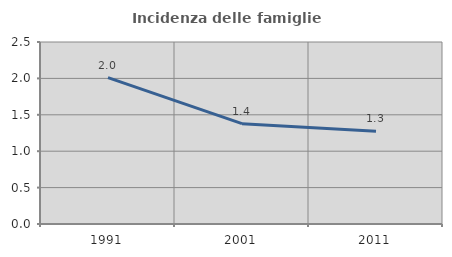
| Category | Incidenza delle famiglie numerose |
|---|---|
| 1991.0 | 2.011 |
| 2001.0 | 1.378 |
| 2011.0 | 1.276 |